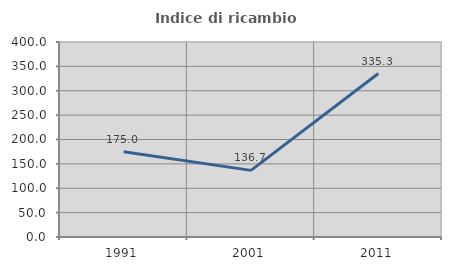
| Category | Indice di ricambio occupazionale  |
|---|---|
| 1991.0 | 175 |
| 2001.0 | 136.667 |
| 2011.0 | 335.294 |